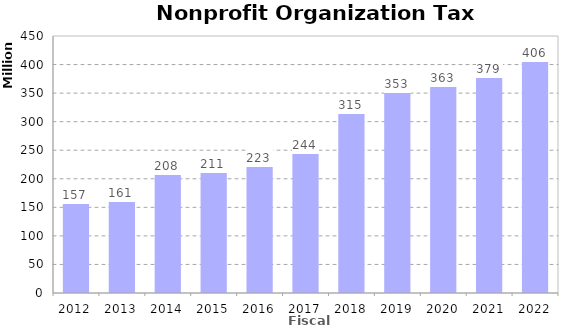
| Category | Amount ($) |
|---|---|
| 2012.0 | 156945693.354 |
| 2013.0 | 161434467.789 |
| 2014.0 | 208366102.088 |
| 2015.0 | 210994603.365 |
| 2016.0 | 223074819.582 |
| 2017.0 | 244370076.328 |
| 2018.0 | 314543689.447 |
| 2019.0 | 352673576.32 |
| 2020.0 | 362781521.933 |
| 2021.0 | 378603136.285 |
| 2022.0 | 406492802.465 |